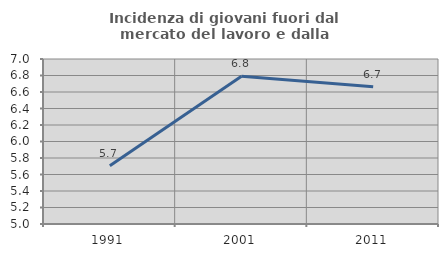
| Category | Incidenza di giovani fuori dal mercato del lavoro e dalla formazione  |
|---|---|
| 1991.0 | 5.706 |
| 2001.0 | 6.791 |
| 2011.0 | 6.663 |